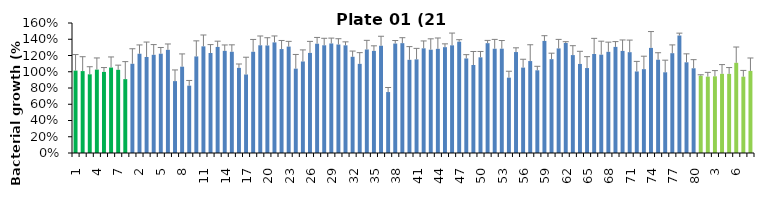
| Category | 21 h % |
|---|---|
| 1.0 | 1.014 |
| 2.0 | 1.008 |
| 3.0 | 0.969 |
| 4.0 | 1.026 |
| 5.0 | 0.998 |
| 6.0 | 1.052 |
| 7.0 | 1.024 |
| 8.0 | 0.909 |
| 1.0 | 1.098 |
| 2.0 | 1.222 |
| 3.0 | 1.182 |
| 4.0 | 1.209 |
| 5.0 | 1.222 |
| 6.0 | 1.27 |
| 7.0 | 0.885 |
| 8.0 | 1.063 |
| 9.0 | 0.829 |
| 10.0 | 1.189 |
| 11.0 | 1.313 |
| 12.0 | 1.231 |
| 13.0 | 1.305 |
| 14.0 | 1.257 |
| 15.0 | 1.246 |
| 16.0 | 1.048 |
| 17.0 | 0.966 |
| 18.0 | 1.246 |
| 19.0 | 1.326 |
| 20.0 | 1.324 |
| 21.0 | 1.361 |
| 22.0 | 1.279 |
| 23.0 | 1.31 |
| 24.0 | 1.038 |
| 25.0 | 1.127 |
| 26.0 | 1.232 |
| 27.0 | 1.345 |
| 28.0 | 1.326 |
| 29.0 | 1.348 |
| 30.0 | 1.335 |
| 31.0 | 1.325 |
| 32.0 | 1.184 |
| 33.0 | 1.097 |
| 34.0 | 1.274 |
| 35.0 | 1.257 |
| 36.0 | 1.32 |
| 37.0 | 0.75 |
| 38.0 | 1.347 |
| 39.0 | 1.352 |
| 40.0 | 1.147 |
| 41.0 | 1.153 |
| 42.0 | 1.288 |
| 43.0 | 1.271 |
| 44.0 | 1.282 |
| 45.0 | 1.303 |
| 46.0 | 1.325 |
| 47.0 | 1.37 |
| 48.0 | 1.164 |
| 49.0 | 1.083 |
| 50.0 | 1.177 |
| 51.0 | 1.352 |
| 52.0 | 1.283 |
| 53.0 | 1.284 |
| 54.0 | 0.927 |
| 55.0 | 1.243 |
| 56.0 | 1.051 |
| 57.0 | 1.132 |
| 58.0 | 1.018 |
| 59.0 | 1.38 |
| 60.0 | 1.155 |
| 61.0 | 1.287 |
| 62.0 | 1.354 |
| 63.0 | 1.205 |
| 64.0 | 1.096 |
| 65.0 | 1.046 |
| 66.0 | 1.219 |
| 67.0 | 1.21 |
| 68.0 | 1.245 |
| 69.0 | 1.306 |
| 70.0 | 1.257 |
| 71.0 | 1.241 |
| 72.0 | 1.004 |
| 73.0 | 1.032 |
| 74.0 | 1.294 |
| 75.0 | 1.148 |
| 76.0 | 0.993 |
| 77.0 | 1.228 |
| 78.0 | 1.446 |
| 79.0 | 1.116 |
| 80.0 | 1.043 |
| 1.0 | 0.952 |
| 2.0 | 0.94 |
| 3.0 | 0.944 |
| 4.0 | 0.974 |
| 5.0 | 0.974 |
| 6.0 | 1.11 |
| 7.0 | 0.939 |
| 8.0 | 1.01 |